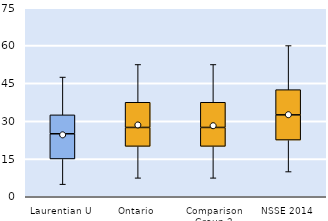
| Category | 25th | 50th | 75th |
|---|---|---|---|
| Laurentian U | 15 | 10 | 7.5 |
| Ontario | 20 | 7.5 | 10 |
| Comparison Group 2 | 20 | 7.5 | 10 |
| NSSE 2014 | 22.5 | 10 | 10 |